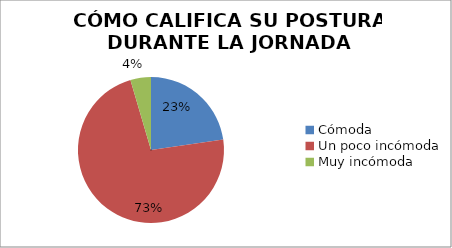
| Category | Series 0 |
|---|---|
| Cómoda | 5 |
| Un poco incómoda | 16 |
| Muy incómoda | 1 |